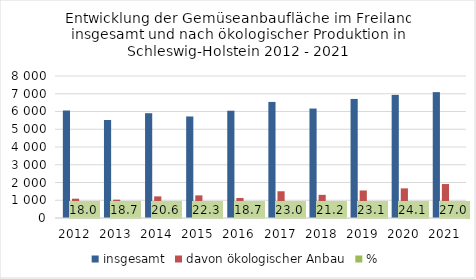
| Category | insgesamt | davon ökologischer Anbau | % |
|---|---|---|---|
| 2012.0 | 6058.2 | 1088.1 | 17.961 |
| 2013.0 | 5528.1 | 1031.9 | 18.666 |
| 2014.0 | 5904 | 1218.2 | 20.633 |
| 2015.0 | 5720 | 1274.2 | 22.276 |
| 2016.0 | 6043.5 | 1129.1 | 18.683 |
| 2017.0 | 6539.1 | 1506.3 | 23.035 |
| 2018.0 | 6166.7 | 1304.6 | 21.156 |
| 2019.0 | 6708.6 | 1550.3 | 23.109 |
| 2020.0 | 6936.8 | 1669.5 | 24.067 |
| 2021.0 | 7090.9 | 1912.9 | 26.977 |